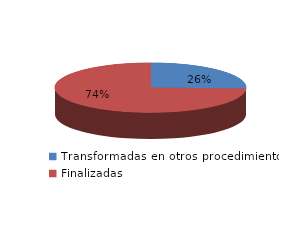
| Category | Series 0 |
|---|---|
| Transformadas en otros procedimientos | 1058 |
| Finalizadas | 3088 |